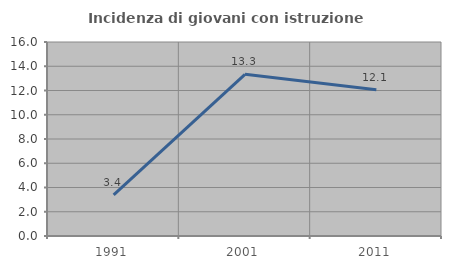
| Category | Incidenza di giovani con istruzione universitaria |
|---|---|
| 1991.0 | 3.39 |
| 2001.0 | 13.333 |
| 2011.0 | 12.069 |